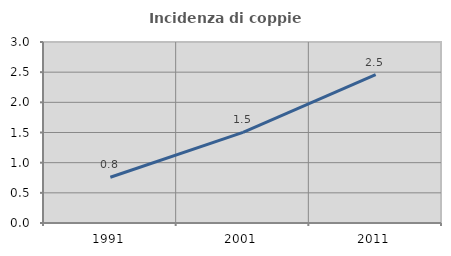
| Category | Incidenza di coppie miste |
|---|---|
| 1991.0 | 0.758 |
| 2001.0 | 1.501 |
| 2011.0 | 2.46 |